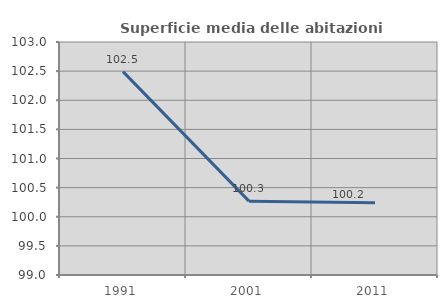
| Category | Superficie media delle abitazioni occupate |
|---|---|
| 1991.0 | 102.492 |
| 2001.0 | 100.268 |
| 2011.0 | 100.241 |